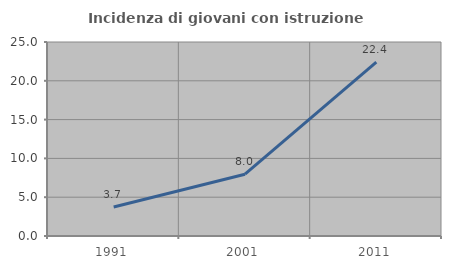
| Category | Incidenza di giovani con istruzione universitaria |
|---|---|
| 1991.0 | 3.744 |
| 2001.0 | 7.965 |
| 2011.0 | 22.417 |